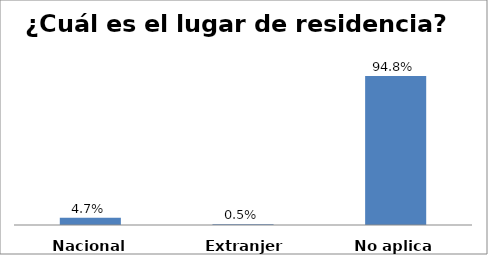
| Category | Series 0 |
|---|---|
| Nacional | 0.047 |
| Extranjero | 0.005 |
| No aplica | 0.948 |